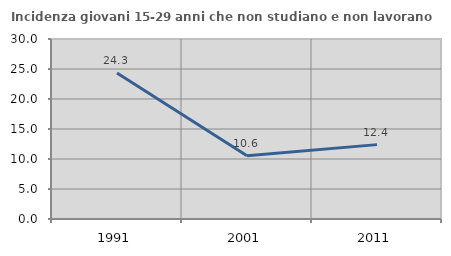
| Category | Incidenza giovani 15-29 anni che non studiano e non lavorano  |
|---|---|
| 1991.0 | 24.322 |
| 2001.0 | 10.55 |
| 2011.0 | 12.397 |